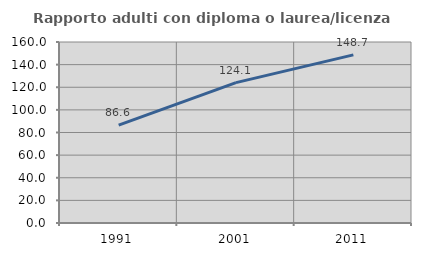
| Category | Rapporto adulti con diploma o laurea/licenza media  |
|---|---|
| 1991.0 | 86.58 |
| 2001.0 | 124.076 |
| 2011.0 | 148.651 |